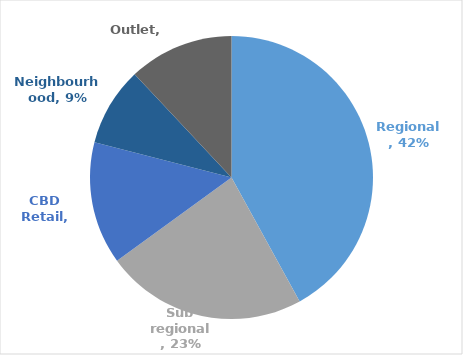
| Category | Series 0 |
|---|---|
| Regional | 0.42 |
| Sub regional | 0.23 |
| CBD Retail | 0.14 |
| Neighbourhood | 0.09 |
| Outlet | 0.12 |